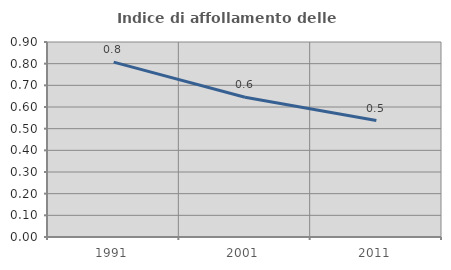
| Category | Indice di affollamento delle abitazioni  |
|---|---|
| 1991.0 | 0.807 |
| 2001.0 | 0.645 |
| 2011.0 | 0.537 |